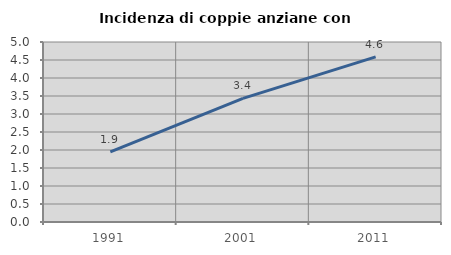
| Category | Incidenza di coppie anziane con figli |
|---|---|
| 1991.0 | 1.949 |
| 2001.0 | 3.433 |
| 2011.0 | 4.586 |